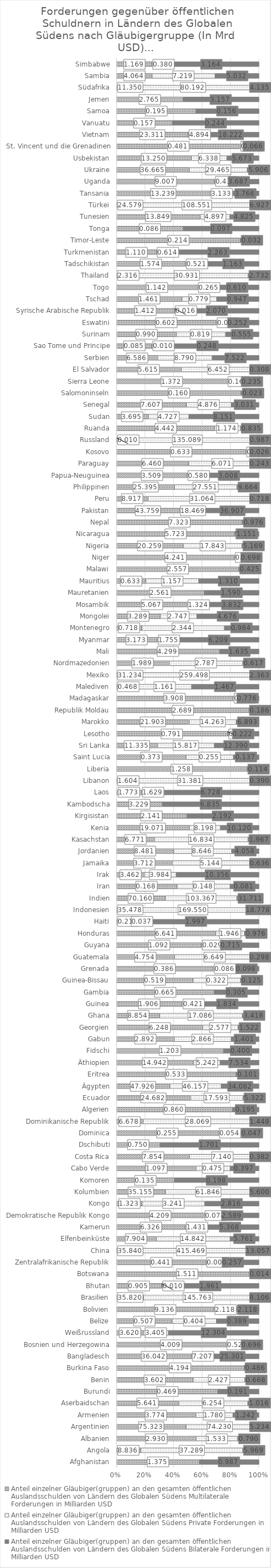
| Category | Anteil einzelner Gläubiger(gruppen) an den gesamten öffentlichen Auslandsschulden von Ländern des Globalen Südens |
|---|---|
| Afghanistan | 0.987 |
| Angola | 5.969 |
| Albanien | 0.79 |
| Argentinien | 5.234 |
| Armenien | 1.242 |
| Aserbaidschan | 1.016 |
| Burundi | 0.191 |
| Benin | 0.668 |
| Burkina Faso | 0.486 |
| Bangladesch | 25.301 |
| Bosnien und Herzegowina | 0.696 |
| Weißrussland | 12.304 |
| Belize | 0.389 |
| Bolivien | 2.118 |
| Brasilien | 8.106 |
| Bhutan | 1.961 |
| Botswana | 0.014 |
| Zentralafrikanische Republik | 0.257 |
| China | 13.057 |
| Elfenbeinküste | 5.761 |
| Kamerun | 5.368 |
| Demokratische Republik Kongo | 2.589 |
| Kongo | 2.816 |
| Kolumbien | 5.6 |
| Komoren | 0.198 |
| Cabo Verde | 0.397 |
| Costa Rica | 0.382 |
| Dschibuti | 1.701 |
| Dominica | 0.047 |
| Dominikanische Republik | 1.448 |
| Algerien | 0.195 |
| Ecuador | 5.322 |
| Ägypten | 34.082 |
| Eritrea | 0.101 |
| Äthiopien | 7.534 |
| Fidschi | 0.4 |
| Gabun | 1.401 |
| Georgien | 1.522 |
| Ghana | 3.418 |
| Guinea | 1.834 |
| Gambia | 0.305 |
| Guinea-Bissau | 0.125 |
| Grenada | 0.098 |
| Guatemala | 0.298 |
| Guyana | 0.715 |
| Honduras | 0.976 |
| Haiti | 1.997 |
| Indonesien | 18.778 |
| Indien | 31.711 |
| Iran | 0.081 |
| Irak | 10.356 |
| Jamaika | 0.636 |
| Jordanien | 4.058 |
| Kasachstan | 1.967 |
| Kenia | 10.12 |
| Kirgisistan | 2.192 |
| Kambodscha | 6.835 |
| Laos | 6.728 |
| Libanon | 0.39 |
| Liberia | 0.114 |
| Saint Lucia | 0.137 |
| Sri Lanka | 12.39 |
| Lesotho | 0.222 |
| Marokko | 6.893 |
| Republik Moldau | 0.186 |
| Madagaskar | 0.776 |
| Malediven | 1.467 |
| Mexiko | 2.363 |
| Nordmazedonien | 0.617 |
| Mali | 1.635 |
| Myanmar | 6.209 |
| Montenegro | 0.984 |
| Mongolei | 4.676 |
| Mosambik | 3.832 |
| Mauretanien | 1.59 |
| Mauritius | 1.31 |
| Malawi | 0.425 |
| Niger | 0.698 |
| Nigeria | 5.169 |
| Nicaragua | 1.151 |
| Nepal | 0.976 |
| Pakistan | 36.907 |
| Peru | 0.718 |
| Philippinen | 9.664 |
| Papua-Neuguinea | 3.008 |
| Paraguay | 0.243 |
| Kosovo | 0.026 |
| Russland | 0.987 |
| Ruanda | 0.835 |
| Sudan | 8.151 |
| Senegal | 3.031 |
| Salomoninseln | 0.023 |
| Sierra Leone | 0.235 |
| El Salvador | 0.308 |
| Serbien | 7.522 |
| Sao Tome und Principe | 0.248 |
| Surinam | 0.555 |
| Eswatini | 0.252 |
| Syrische Arabische Republik | 2.07 |
| Tschad | 0.947 |
| Togo | 0.61 |
| Thailand | 2.732 |
| Tadschikistan | 1.163 |
| Turkmenistan | 2.263 |
| Timor-Leste | 0.032 |
| Tonga | 0.097 |
| Tunesien | 4.825 |
| Türkei | 6.927 |
| Tansania | 3.766 |
| Uganda | 3.687 |
| Ukraine | 5.906 |
| Usbekistan | 5.673 |
| St. Vincent und die Grenadinen | 0.066 |
| Vietnam | 18.222 |
| Vanuatu | 0.244 |
| Samoa | 0.156 |
| Jemen | 3.157 |
| Südafrika | 4.135 |
| Sambia | 5.032 |
| Simbabwe | 3.164 |